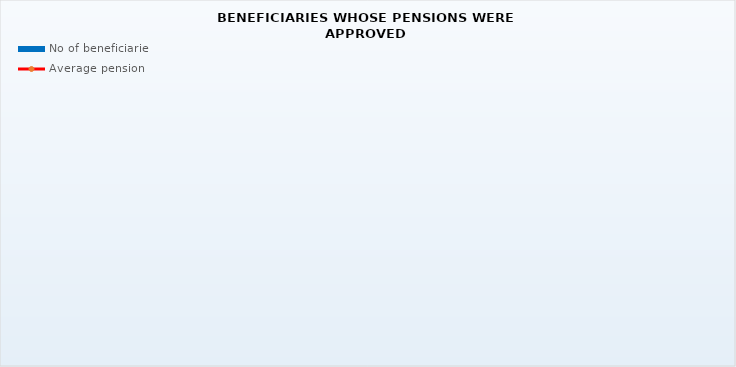
| Category | No of beneficiaries |
|---|---|
| Authorised officials in internal affairs, judicial officers and workers engaged in demining work: | 17264 |
| Active military personnel - DVO  | 15523 |
| Croatian Homeland Army veterans mobilised from 1941 to 1945 | 4496 |
| Former political prisoners | 2911 |
| Croatian Veterans from the Homeland War - ZOHBDR (Act on the Rights of Croatian Homeland War Veterans and their Family Members) | 71233 |
| Pensions approved under general regulations and determined according to the Act on the Rights of Croatian Homeland War Veterans and their Family Members (ZOHBDR), in 2017 (Art. 27, 35, 48 and 49, paragraph 2)    | 40183 |
| Former Yugoslav People's Army members - JNA   | 5701 |
| Former Yugoslav People's Army members - JNA - Art. 185 of Pension Insurance Act (ZOMO)  | 138 |
| National Liberation War veterans - NOR | 10509 |
| Members of the Croatian Parliament, members of the Government, judges of the Constitutional Court and the Auditor General | 672 |
| Members of the Parliamentary Executive Council and administratively retired federal civil servants  (relates to the former SFRY) | 97 |
| Former officials of federal bodies o the former SFRJ -  Article 38 of the Pension Insurance Act (ZOMO) | 34 |
| Full members of the Croatian Academy of Sciences and Arts - HAZU | 146 |
| Miners from the Istrian coal mines "Tupljak" d.d. Labin  | 254 |
| Workers professionally exposed to asbestos | 871 |
| Insurees - crew members on a ship in international and national navigation  - Article  129, paragraph 2 of the Maritime Code | 165 |
| Members of the Croatian Defence Council - HVO  | 6723 |